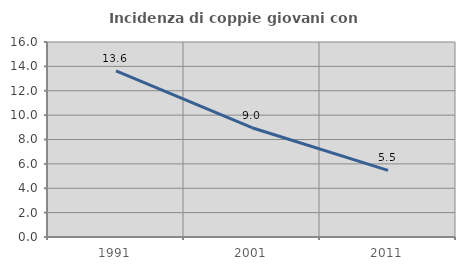
| Category | Incidenza di coppie giovani con figli |
|---|---|
| 1991.0 | 13.636 |
| 2001.0 | 8.967 |
| 2011.0 | 5.464 |